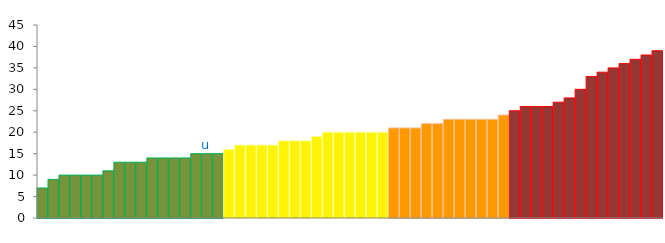
| Category | Top Quartile | 2nd Quartile | 3rd Quartile | Bottom Quartile | Series 4 |
|---|---|---|---|---|---|
|  | 7 | 0 | 0 | 0 | 7 |
|  | 9 | 0 | 0 | 0 | 9 |
|  | 10 | 0 | 0 | 0 | 10 |
|  | 10 | 0 | 0 | 0 | 10 |
|  | 10 | 0 | 0 | 0 | 10 |
|  | 10 | 0 | 0 | 0 | 10 |
|  | 11 | 0 | 0 | 0 | 11 |
|  | 13 | 0 | 0 | 0 | 13 |
|  | 13 | 0 | 0 | 0 | 13 |
|  | 13 | 0 | 0 | 0 | 13 |
|  | 14 | 0 | 0 | 0 | 14 |
|  | 14 | 0 | 0 | 0 | 14 |
|  | 14 | 0 | 0 | 0 | 14 |
|  | 14 | 0 | 0 | 0 | 14 |
|  | 15 | 0 | 0 | 0 | 15 |
| u | 15 | 0 | 0 | 0 | 15 |